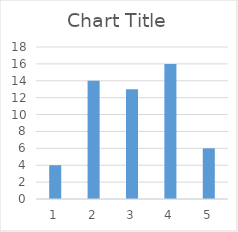
| Category | Series 0 |
|---|---|
| 0 | 4 |
| 1 | 14 |
| 2 | 13 |
| 3 | 16 |
| 4 | 6 |